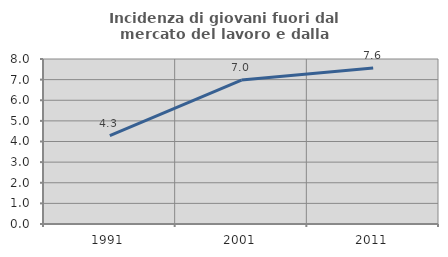
| Category | Incidenza di giovani fuori dal mercato del lavoro e dalla formazione  |
|---|---|
| 1991.0 | 4.286 |
| 2001.0 | 6.977 |
| 2011.0 | 7.563 |